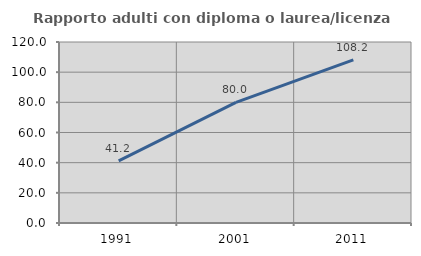
| Category | Rapporto adulti con diploma o laurea/licenza media  |
|---|---|
| 1991.0 | 41.235 |
| 2001.0 | 80 |
| 2011.0 | 108.166 |